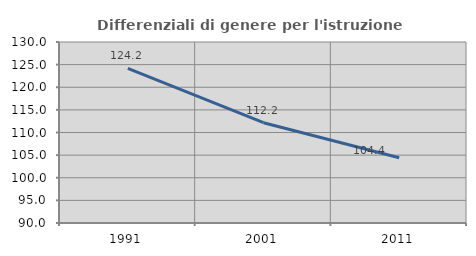
| Category | Differenziali di genere per l'istruzione superiore |
|---|---|
| 1991.0 | 124.159 |
| 2001.0 | 112.164 |
| 2011.0 | 104.411 |